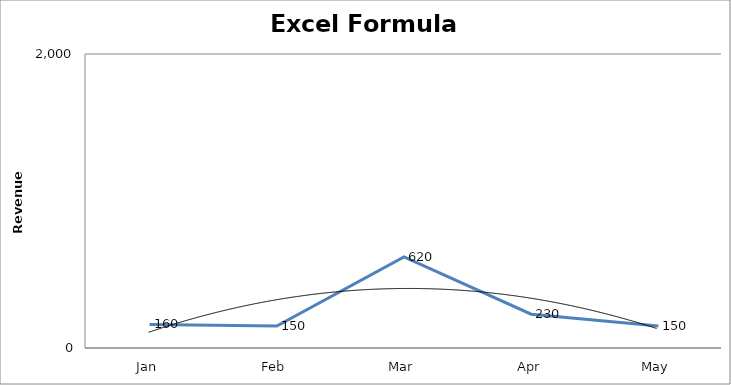
| Category | Excel Formula e-book |
|---|---|
|  Jan  | 160 |
|  Feb  | 150 |
|  Mar  | 620 |
|  Apr  | 230 |
|  May  | 150 |